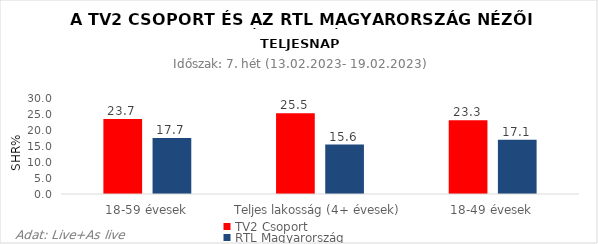
| Category | TV2 Csoport | RTL Magyarország |
|---|---|---|
| 18-59 évesek | 23.7 | 17.7 |
| Teljes lakosság (4+ évesek) | 25.5 | 15.6 |
| 18-49 évesek | 23.3 | 17.1 |